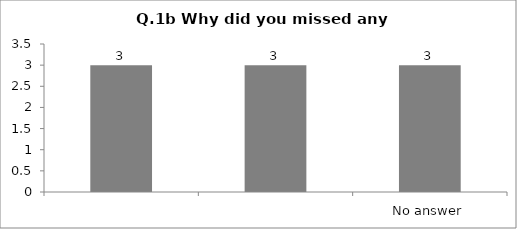
| Category | Q.1b Why did You Missed any Sessions? Please Tick All That Apply |
|---|---|
|  | 3 |
|  | 3 |
| No answer | 3 |